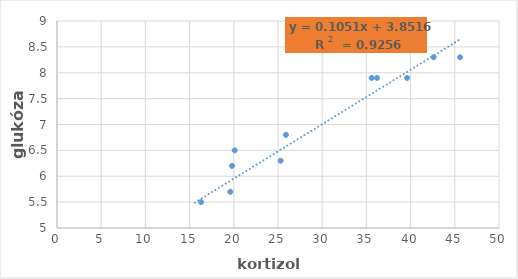
| Category | glukóza (mmol/l) |
|---|---|
| 16.3 | 5.5 |
| 25.3 | 6.3 |
| 35.6 | 7.9 |
| 19.6 | 5.7 |
| 15.6 | 4.9 |
| 42.6 | 8.3 |
| 36.2 | 7.9 |
| 25.9 | 6.8 |
| 20.1 | 6.5 |
| 19.8 | 6.2 |
| 39.6 | 7.9 |
| 45.6 | 8.3 |